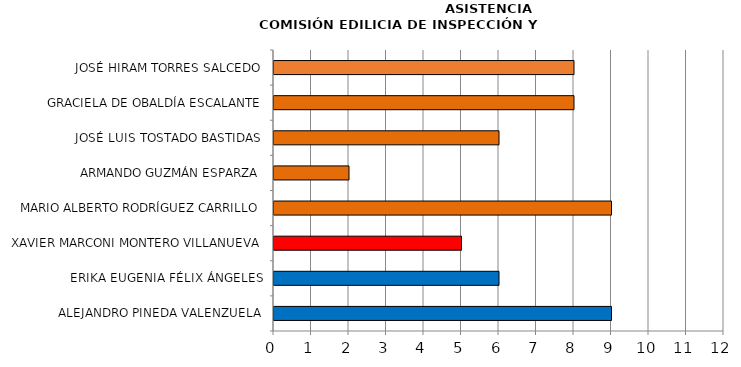
| Category | Series 0 |
|---|---|
| ALEJANDRO PINEDA VALENZUELA | 9 |
| ERIKA EUGENIA FÉLIX ÁNGELES | 6 |
| XAVIER MARCONI MONTERO VILLANUEVA | 5 |
| MARIO ALBERTO RODRÍGUEZ CARRILLO | 9 |
| ARMANDO GUZMÁN ESPARZA | 2 |
| JOSÉ LUIS TOSTADO BASTIDAS | 6 |
| GRACIELA DE OBALDÍA ESCALANTE | 8 |
| JOSÉ HIRAM TORRES SALCEDO | 8 |